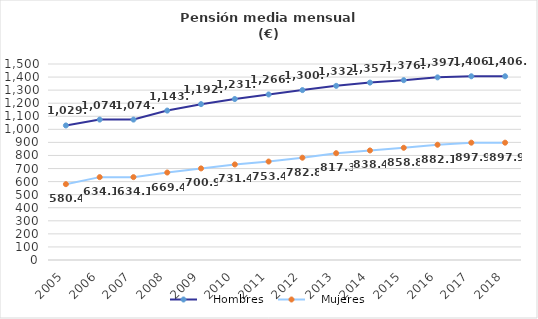
| Category |    Hombres |    Mujeres |
|---|---|---|
| 2005.0 | 1029.684 | 580.448 |
| 2006.0 | 1074.58 | 634.14 |
| 2007.0 | 1074.58 | 634.14 |
| 2008.0 | 1143.51 | 669.42 |
| 2009.0 | 1192.74 | 700.88 |
| 2010.0 | 1231.92 | 731.43 |
| 2011.0 | 1266.86 | 753.41 |
| 2012.0 | 1300.25 | 782.84 |
| 2013.0 | 1332.81 | 817.34 |
| 2014.0 | 1357.6 | 838.39 |
| 2015.0 | 1376.18 | 858.75 |
| 2016.0 | 1397.653 | 882.1 |
| 2017.0 | 1406.073 | 897.88 |
| 2018.0 | 1406.073 | 897.88 |